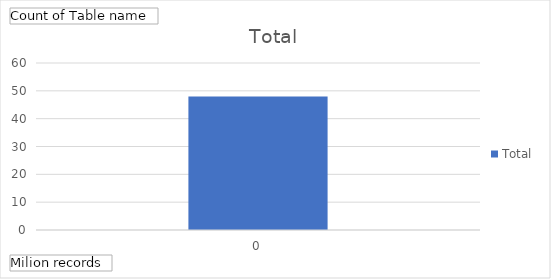
| Category | Total |
|---|---|
| 0 | 48 |